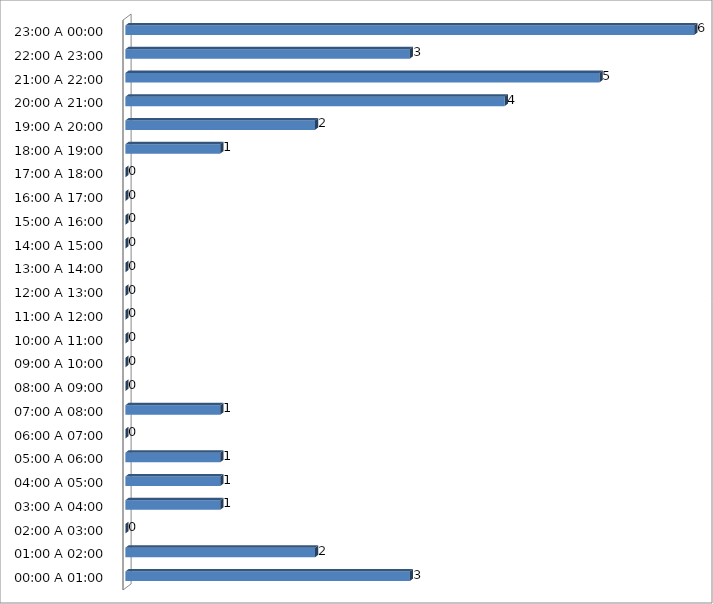
| Category | Series 0 |
|---|---|
| 00:00 A 01:00 | 3 |
| 01:00 A 02:00 | 2 |
| 02:00 A 03:00 | 0 |
| 03:00 A 04:00 | 1 |
| 04:00 A 05:00 | 1 |
| 05:00 A 06:00 | 1 |
| 06:00 A 07:00 | 0 |
| 07:00 A 08:00 | 1 |
| 08:00 A 09:00 | 0 |
| 09:00 A 10:00 | 0 |
| 10:00 A 11:00 | 0 |
| 11:00 A 12:00 | 0 |
| 12:00 A 13:00 | 0 |
| 13:00 A 14:00 | 0 |
| 14:00 A 15:00 | 0 |
| 15:00 A 16:00 | 0 |
| 16:00 A 17:00 | 0 |
| 17:00 A 18:00 | 0 |
| 18:00 A 19:00 | 1 |
| 19:00 A 20:00 | 2 |
| 20:00 A 21:00 | 4 |
| 21:00 A 22:00 | 5 |
| 22:00 A 23:00 | 3 |
| 23:00 A 00:00 | 6 |